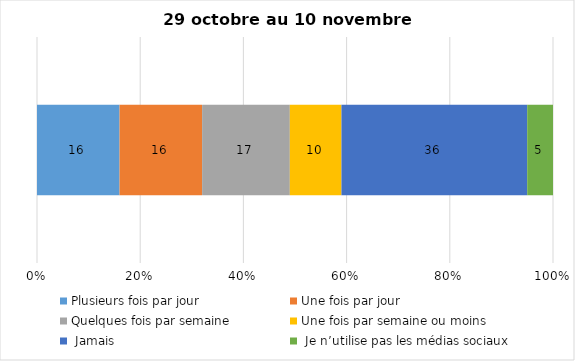
| Category | Plusieurs fois par jour | Une fois par jour | Quelques fois par semaine   | Une fois par semaine ou moins   |  Jamais   |  Je n’utilise pas les médias sociaux |
|---|---|---|---|---|---|---|
| 0 | 16 | 16 | 17 | 10 | 36 | 5 |